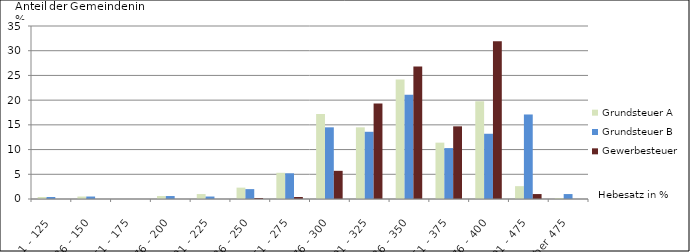
| Category | Grundsteuer A | Grundsteuer B | Gewerbesteuer |
|---|---|---|---|
| 1 - 125 | 0.4 | 0.4 | 0 |
| 126 - 150 | 0.5 | 0.5 | 0 |
| 151 - 175 | 0 | 0 | 0 |
| 176 - 200 | 0.6 | 0.6 | 0 |
| 201 - 225 | 1 | 0.5 | 0 |
| 226 - 250 | 2.3 | 2 | 0.2 |
| 251 - 275 | 5.3 | 5.2 | 0.4 |
| 276 - 300 | 17.2 | 14.5 | 5.7 |
| 301 - 325 | 14.5 | 13.6 | 19.3 |
| 326 - 350 | 24.2 | 21.1 | 26.8 |
| 351 - 375 | 11.4 | 10.3 | 14.7 |
| 376 - 400 | 19.8 | 13.2 | 31.9 |
| 401 - 475 | 2.6 | 17.1 | 1 |
| über 475 | 0.2 | 1 | 0 |